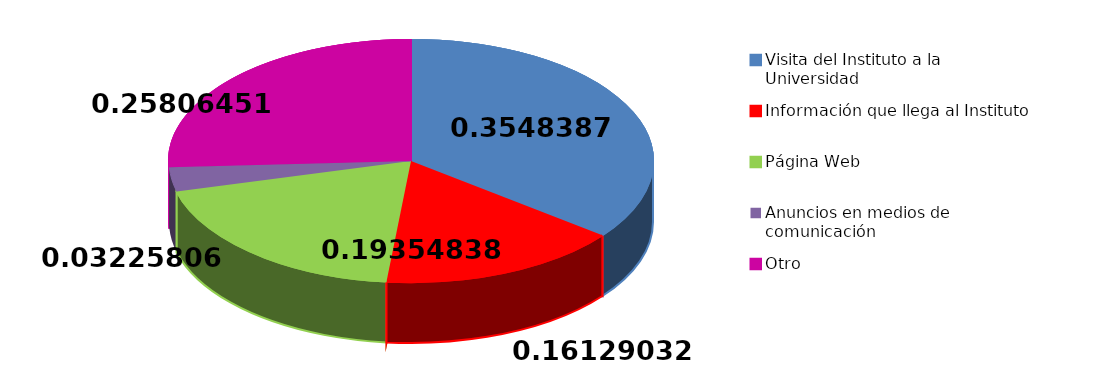
| Category | Sí | No |
|---|---|---|
| Visita del Instituto a la Universidad | 11 |  |
| Información que llega al Instituto | 5 |  |
| Página Web | 6 |  |
| Anuncios en medios de comunicación | 1 |  |
| Otro | 8 |  |